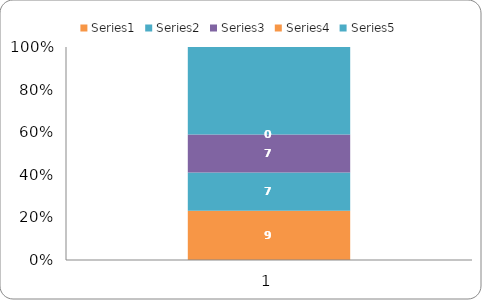
| Category | Series 0 | Series 1 | Series 2 | Series 3 | Series 4 |
|---|---|---|---|---|---|
| 0 | 9 | 7 | 7 | 0 | 16 |